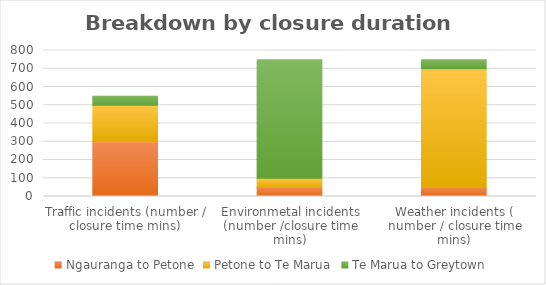
| Category | Ngauranga to Petone | Petone to Te Marua | Te Marua to Greytown |
|---|---|---|---|
| Traffic incidents (number / closure time mins) | 300 | 200 | 50 |
| Environmetal incidents (number /closure time mins) | 50 | 50 | 650 |
| Weather incidents ( number / closure time mins) | 50 | 650 | 50 |